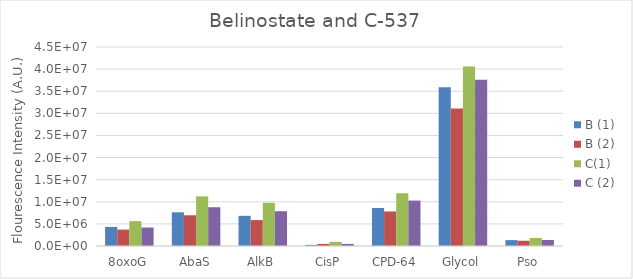
| Category | B (1) | B (2) | C(1) | C (2) |
|---|---|---|---|---|
| 8oxoG | 4314110 | 3711090 | 5621772 | 4182217 |
| AbaS | 7614099 | 6947473 | 11222855 | 8765817 |
| AlkB | 6822217 | 5857221 | 9766696 | 7869521 |
| CisP | 258801 | 475116 | 934148 | 471853 |
| CPD-64 | 8602188 | 7815749 | 11921288 | 10268998 |
| Glycol | 35918553 | 31094146 | 40566942 | 37597286 |
| Pso | 1328408 | 1184086 | 1818466 | 1354674 |